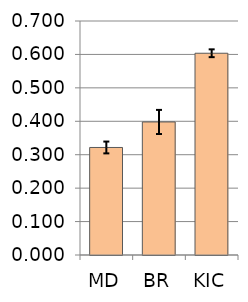
| Category | MD BR KIC |
|---|---|
| MD | 0.322 |
| BR | 0.398 |
| KIC | 0.604 |